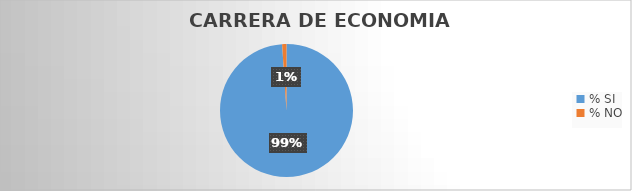
| Category | Series 0 |
|---|---|
| % SI | 98.947 |
| % NO | 1.053 |